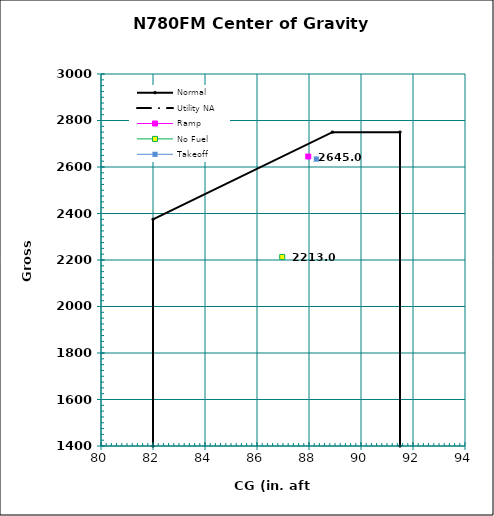
| Category | Normal |
|---|---|
| 82.0 | 1400 |
| 82.0 | 2375 |
| 88.9 | 2750 |
| 91.5 | 2750 |
| 91.5 | 1400 |